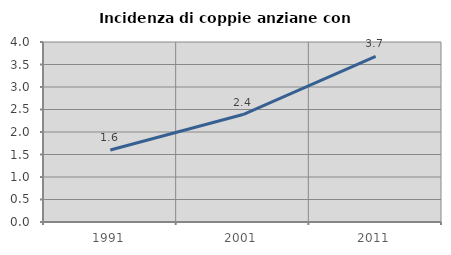
| Category | Incidenza di coppie anziane con figli |
|---|---|
| 1991.0 | 1.601 |
| 2001.0 | 2.388 |
| 2011.0 | 3.683 |